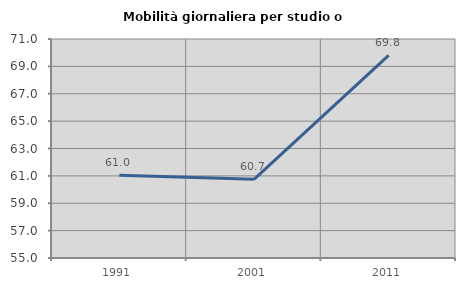
| Category | Mobilità giornaliera per studio o lavoro |
|---|---|
| 1991.0 | 61.043 |
| 2001.0 | 60.747 |
| 2011.0 | 69.8 |